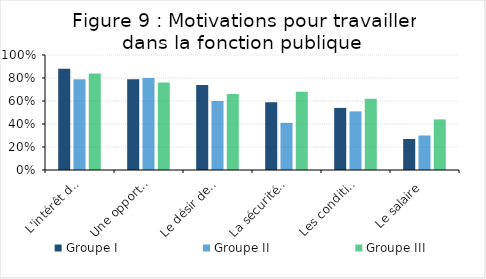
| Category | Groupe I | Groupe II | Groupe III |
|---|---|---|---|
| L'intérêt du métier exercé | 0.88 | 0.79 | 0.84 |
| Une opportunité d'emploi | 0.79 | 0.8 | 0.76 |
| Le désir de servir l'intérêt général | 0.74 | 0.6 | 0.66 |
| La sécurité de l'emploi | 0.59 | 0.41 | 0.68 |
| Les conditions de travail et de rémunération | 0.54 | 0.51 | 0.62 |
| Le salaire | 0.27 | 0.3 | 0.44 |